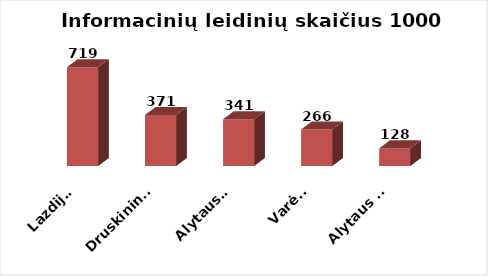
| Category | Series 0 |
|---|---|
| Lazdijai | 719.406 |
| Druskininkai | 371.285 |
| Alytaus r. | 340.964 |
| Varėna | 265.641 |
| Alytaus m. | 128.421 |